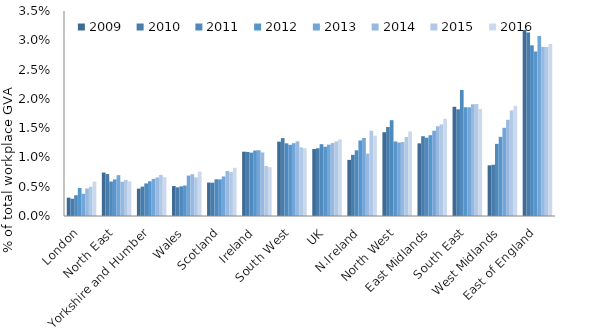
| Category | 2009 | 2010 | 2011 | 2012 | 2013 | 2014 | 2015 | 2016 |
|---|---|---|---|---|---|---|---|---|
| London | 0.003 | 0.003 | 0.004 | 0.005 | 0.004 | 0.005 | 0.005 | 0.006 |
| North East | 0.007 | 0.007 | 0.006 | 0.006 | 0.007 | 0.006 | 0.006 | 0.006 |
| Yorkshire and Humber | 0.005 | 0.005 | 0.006 | 0.006 | 0.006 | 0.007 | 0.007 | 0.007 |
| Wales | 0.005 | 0.005 | 0.005 | 0.005 | 0.007 | 0.007 | 0.007 | 0.008 |
| Scotland | 0.006 | 0.006 | 0.006 | 0.006 | 0.007 | 0.008 | 0.007 | 0.008 |
| Ireland | 0.011 | 0.011 | 0.011 | 0.011 | 0.011 | 0.011 | 0.009 | 0.008 |
| South West | 0.013 | 0.013 | 0.012 | 0.012 | 0.012 | 0.013 | 0.012 | 0.012 |
| UK | 0.011 | 0.012 | 0.012 | 0.012 | 0.012 | 0.012 | 0.013 | 0.013 |
| N.Ireland | 0.01 | 0.01 | 0.011 | 0.013 | 0.013 | 0.011 | 0.015 | 0.014 |
| North West | 0.014 | 0.015 | 0.016 | 0.013 | 0.013 | 0.013 | 0.013 | 0.014 |
| East Midlands | 0.012 | 0.014 | 0.013 | 0.014 | 0.015 | 0.015 | 0.016 | 0.017 |
| South East | 0.019 | 0.018 | 0.022 | 0.019 | 0.019 | 0.019 | 0.019 | 0.018 |
| West Midlands | 0.009 | 0.009 | 0.012 | 0.014 | 0.015 | 0.016 | 0.018 | 0.019 |
| East of England | 0.032 | 0.031 | 0.029 | 0.028 | 0.031 | 0.029 | 0.029 | 0.029 |